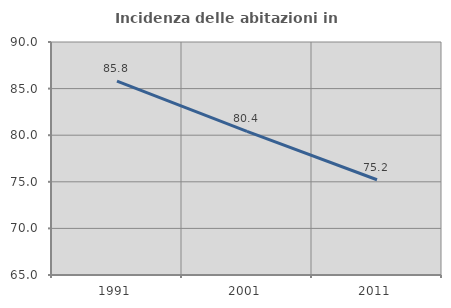
| Category | Incidenza delle abitazioni in proprietà  |
|---|---|
| 1991.0 | 85.801 |
| 2001.0 | 80.401 |
| 2011.0 | 75.217 |